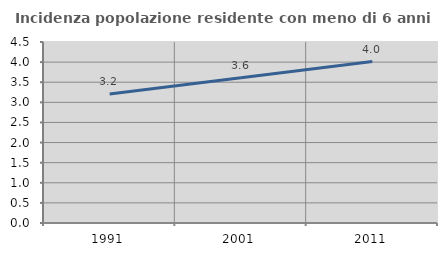
| Category | Incidenza popolazione residente con meno di 6 anni |
|---|---|
| 1991.0 | 3.205 |
| 2001.0 | 3.61 |
| 2011.0 | 4.013 |